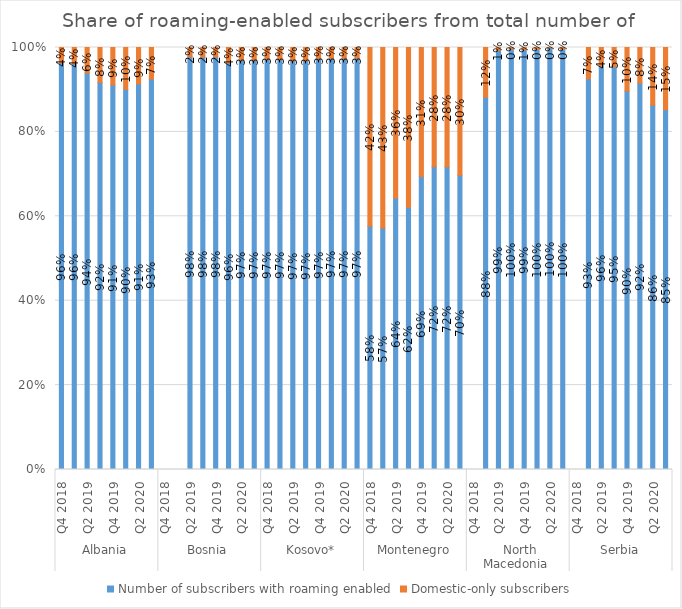
| Category | Number of subscribers with roaming enabled | Domestic-only subscribers |
|---|---|---|
| 0 | 0.964 | 0.036 |
| 1 | 0.961 | 0.039 |
| 2 | 0.939 | 0.061 |
| 3 | 0.917 | 0.083 |
| 4 | 0.911 | 0.089 |
| 5 | 0.901 | 0.099 |
| 6 | 0.914 | 0.086 |
| 7 | 0.925 | 0.075 |
| 8 | 0 | 0 |
| 9 | 0 | 0 |
| 10 | 0.978 | 0.022 |
| 11 | 0.977 | 0.023 |
| 12 | 0.978 | 0.022 |
| 13 | 0.963 | 0.037 |
| 14 | 0.97 | 0.03 |
| 15 | 0.97 | 0.03 |
| 16 | 0.973 | 0.027 |
| 17 | 0.972 | 0.028 |
| 18 | 0.969 | 0.031 |
| 19 | 0.969 | 0.031 |
| 20 | 0.974 | 0.026 |
| 21 | 0.975 | 0.025 |
| 22 | 0.974 | 0.026 |
| 23 | 0.974 | 0.026 |
| 24 | 0.576 | 0.424 |
| 25 | 0.572 | 0.428 |
| 26 | 0.643 | 0.357 |
| 27 | 0.622 | 0.378 |
| 28 | 0.694 | 0.306 |
| 29 | 0.717 | 0.283 |
| 30 | 0.717 | 0.283 |
| 31 | 0.697 | 0.303 |
| 32 | 0 | 0 |
| 33 | 0.882 | 0.118 |
| 34 | 0.993 | 0.007 |
| 35 | 0.997 | 0.003 |
| 36 | 0.995 | 0.005 |
| 37 | 0.996 | 0.004 |
| 38 | 0.998 | 0.002 |
| 39 | 0.996 | 0.004 |
| 40 | 0 | 0 |
| 41 | 0.926 | 0.074 |
| 42 | 0.956 | 0.044 |
| 43 | 0.954 | 0.046 |
| 44 | 0.897 | 0.103 |
| 45 | 0.916 | 0.084 |
| 46 | 0.863 | 0.137 |
| 47 | 0.853 | 0.147 |